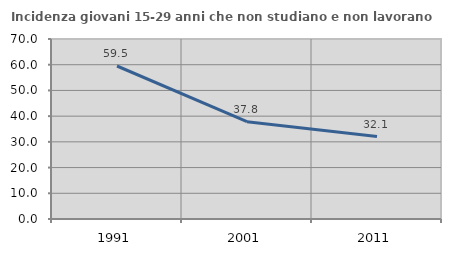
| Category | Incidenza giovani 15-29 anni che non studiano e non lavorano  |
|---|---|
| 1991.0 | 59.5 |
| 2001.0 | 37.825 |
| 2011.0 | 32.064 |